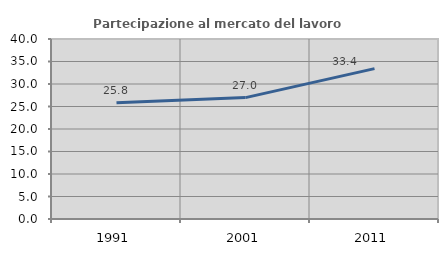
| Category | Partecipazione al mercato del lavoro  femminile |
|---|---|
| 1991.0 | 25.806 |
| 2001.0 | 26.976 |
| 2011.0 | 33.417 |